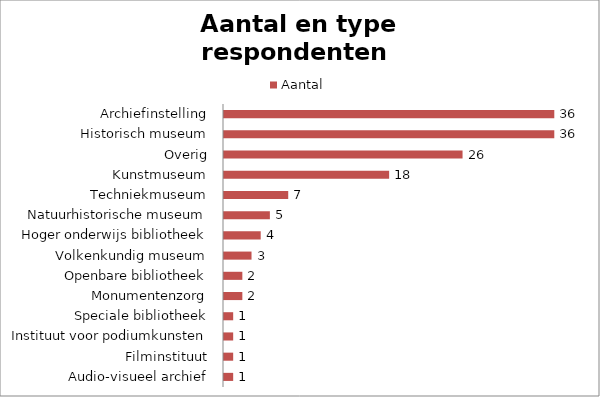
| Category | Aantal |
|---|---|
| Audio-visueel archief | 1 |
| Filminstituut | 1 |
| Instituut voor podiumkunsten | 1 |
| Speciale bibliotheek | 1 |
| Monumentenzorg | 2 |
| Openbare bibliotheek | 2 |
| Volkenkundig museum | 3 |
| Hoger onderwijs bibliotheek | 4 |
| Natuurhistorische museum | 5 |
| Techniekmuseum | 7 |
| Kunstmuseum | 18 |
| Overig | 26 |
| Historisch museum | 36 |
| Archiefinstelling | 36 |